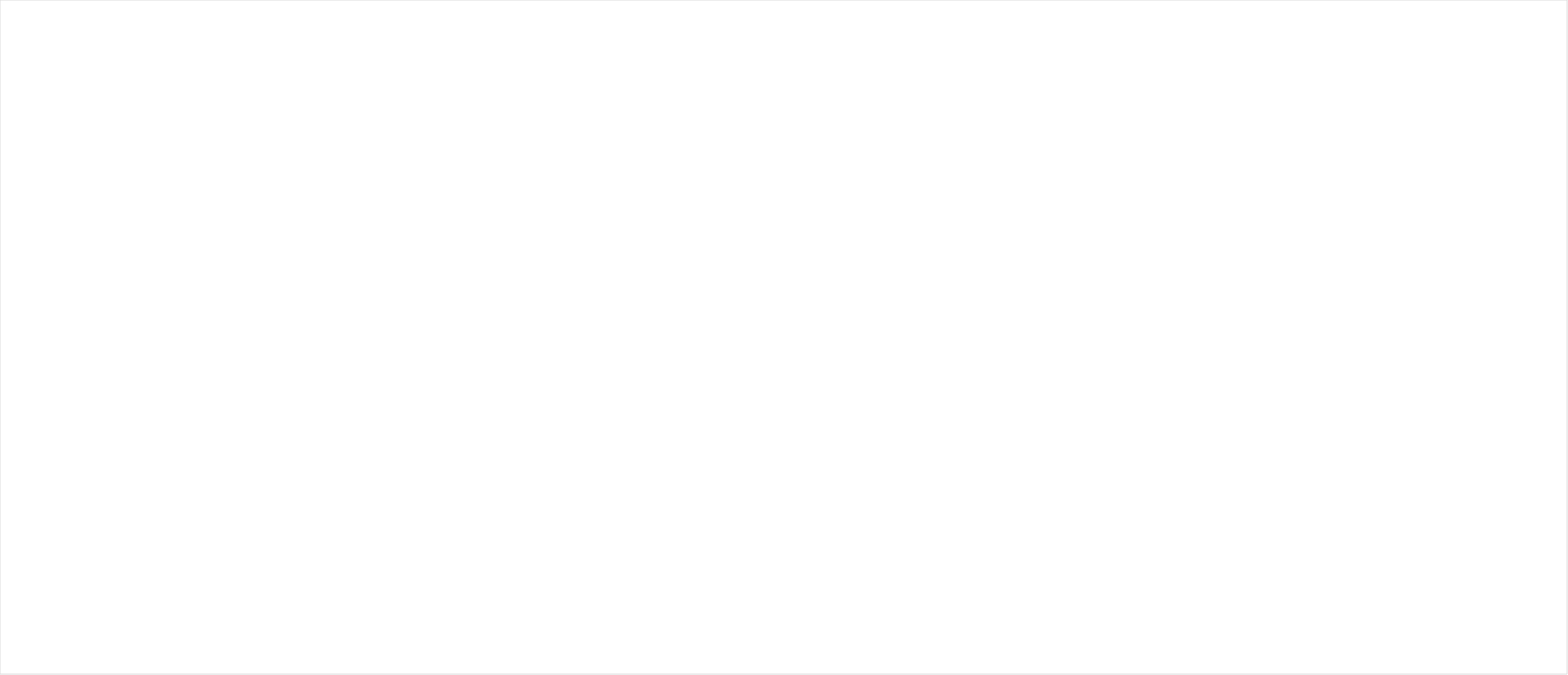
| Category | Series 0 |
|---|---|
| Supporting the young person’s passion for music and the development of skills such as motivation and resilience | 0 |
| Enabling students to use their skills in school to inspire other learners | 0 |
| Engaging in and valuing the music of a young person | 0 |
| Ensuring sustained access to role models and mentors | 0 |
| Facilitating sustained access to varied experiences, opportunities and genres | 0 |
| School leaders and music teachers encourage students to learn music beyond the classroom and can articulate how they compliment each other | 0 |
| School leaders and music teachers articulate how any aspiring musician are encouraged and supported to access high-quality opportunities to reach their full potential, pupils may want to attend a Saturday Music Centre or a local ensemble, in school or beyo | 0 |
| School leaders and music teachers respond to the needs and ambitions of pupils identified as more able in Music | 0 |
| Support for families less familiar with what is possible, mentoring for pupils (e.g. through a Music Hub), help to support and track progression | 0 |
| Music Development Plan is published on the school website helping families to understand how their children will benefit from school music | 0 |
| School supports musical learning through Y6/7 transition, (dialogue with feeder and destination school) | 0 |
| Music progression strategy, is part of the Music Development Plan | 0 |
| Music progression strategy aligns to the school/MAT progression strategy  | 0 |
| Music progression strategy is monitored and reviewed and by music lead, SLT and/or governors | 0 |
| First access to instrumental learning as part of classroom teaching | 0 |
| Access to small-group and 1:1 instrumental tuition | 0 |
| How they will help children to access instruments | 0 |
| Access to space to practice, and to store instruments | 0 |
| Relevant local and national opportunities such as ensembles, choirs, workshops  | 0 |
| Routes into specialist music provision, such as local opportunities with the National Children’s Orchestra or Tomorrow’s Warriors | 0 |
| Musical progression is tracked in and out of the classroom. (Which pupils, and how many, attend take part in musical activity outside of school, e.g. ensembles provided by the Music Hub . This information is used to benefit pupils).  | 0 |
| Musical achievement and progress evidenced. (How? How would you explain it to a stakeholder?) | 0 |